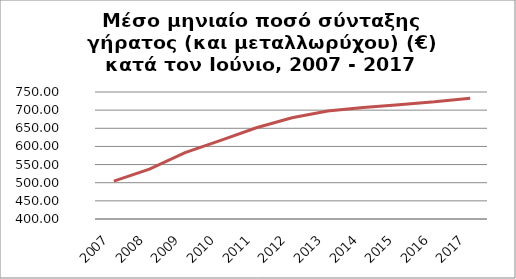
| Category | Series 1 |
|---|---|
| 2007.0 | 504.426 |
| 2008.0 | 537.591 |
| 2009.0 | 582.94 |
| 2010.0 | 616.567 |
| 2011.0 | 651.509 |
| 2012.0 | 678.951 |
| 2013.0 | 697.458 |
| 2014.0 | 707.063 |
| 2015.0 | 715.126 |
| 2016.0 | 722.83 |
| 2017.0 | 732.9 |